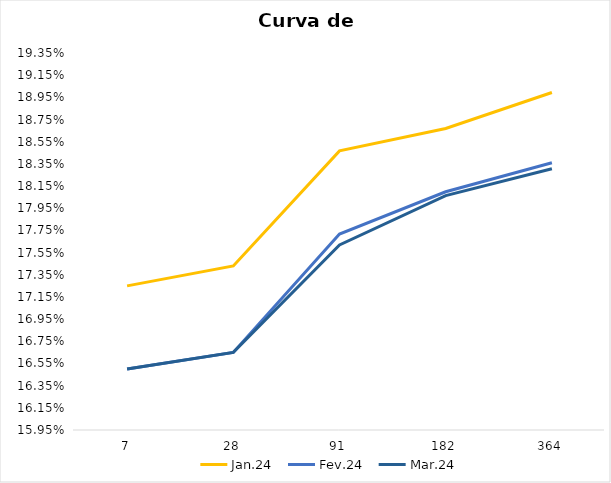
| Category | Jan.24 | Fev.24 | Mar.24 |
|---|---|---|---|
| 7.0 | 0.172 | 0.165 | 0.165 |
| 28.0 | 0.174 | 0.166 | 0.166 |
| 91.0 | 0.185 | 0.177 | 0.176 |
| 182.0 | 0.187 | 0.181 | 0.181 |
| 364.0 | 0.19 | 0.184 | 0.183 |